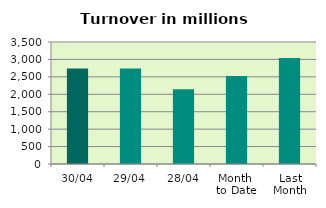
| Category | Series 0 |
|---|---|
| 30/04 | 2738.389 |
| 29/04 | 2739.547 |
| 28/04 | 2142.883 |
| Month 
to Date | 2525.558 |
| Last
Month | 3040.277 |